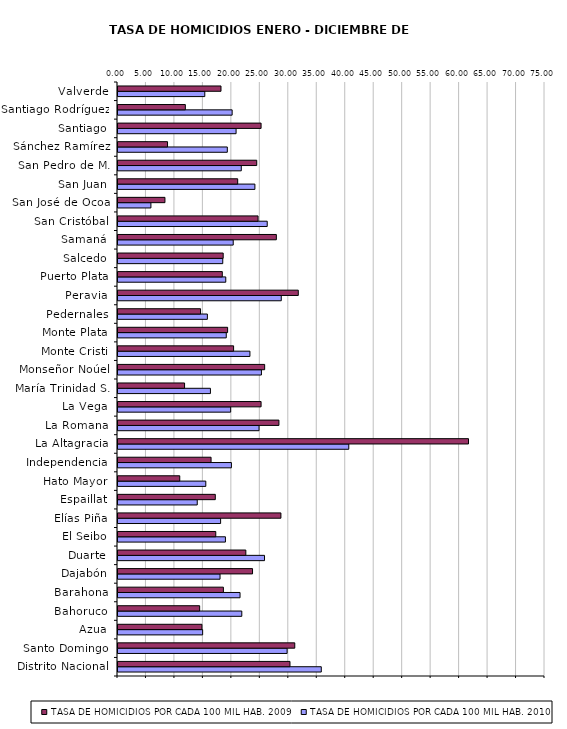
| Category | Series 11 | Series 12 | TASA DE HOMICIDIOS POR CADA 100 MIL HAB. 2010 | Series 13 | Series 14 | TASA DE HOMICIDIOS POR CADA 100 MIL HAB. 2009 |
|---|---|---|---|---|---|---|
| Distrito Nacional |  |  | 35.707 |  |  | 30.207 |
| Santo Domingo |  |  | 29.704 |  |  | 31.048 |
| Azua |  |  | 14.869 |  |  | 14.741 |
| Bahoruco |  |  | 21.745 |  |  | 14.345 |
| Barahona |  |  | 21.435 |  |  | 18.512 |
| Dajabón |  |  | 17.923 |  |  | 23.63 |
| Duarte |  |  | 25.736 |  |  | 22.452 |
| El Seibo |  |  | 18.869 |  |  | 17.173 |
| Elías Piña |  |  | 18.023 |  |  | 28.615 |
| Espaillat |  |  | 13.918 |  |  | 17.09 |
| Hato Mayor |  |  | 15.423 |  |  | 10.848 |
| Independencia |  |  | 19.919 |  |  | 16.346 |
| La Altagracia |  |  | 40.536 |  |  | 61.563 |
| La Romana |  |  | 24.773 |  |  | 28.265 |
| La Vega |  |  | 19.788 |  |  | 25.132 |
| María Trinidad S. |  |  | 16.234 |  |  | 11.693 |
| Monseñor Noúel |  |  | 25.192 |  |  | 25.761 |
| Monte Cristi |  |  | 23.172 |  |  | 20.303 |
| Monte Plata |  |  | 19.015 |  |  | 19.255 |
| Pedernales |  |  | 15.7 |  |  | 14.5 |
| Peravia |  |  | 28.677 |  |  | 31.667 |
| Puerto Plata |  |  | 18.931 |  |  | 18.321 |
| Salcedo |  |  | 18.4 |  |  | 18.476 |
| Samaná |  |  | 20.239 |  |  | 27.814 |
| San Cristóbal |  |  | 26.212 |  |  | 24.601 |
| San José de Ocoa |  |  | 5.78 |  |  | 8.247 |
| San Juan |  |  | 24.045 |  |  | 21.023 |
| San Pedro de M. |  |  | 21.655 |  |  | 24.369 |
| Sánchez Ramírez |  |  | 19.201 |  |  | 8.702 |
| Santiago |  |  | 20.742 |  |  | 25.133 |
| Santiago Rodríguez |  |  | 20.049 |  |  | 11.826 |
| Valverde |  |  | 15.243 |  |  | 18.091 |